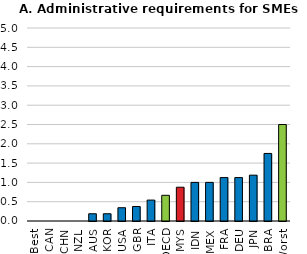
| Category | Series 0 |
|---|---|
| Best | 0 |
| CAN | 0 |
| CHN | 0 |
| NZL | 0 |
| AUS | 0.188 |
| KOR | 0.188 |
| USA | 0.344 |
| GBR | 0.375 |
| ITA | 0.542 |
| OECD | 0.666 |
| MYS | 0.875 |
| IDN | 1 |
| MEX | 1 |
| FRA | 1.125 |
| DEU | 1.125 |
| JPN | 1.188 |
| BRA | 1.75 |
| Worst | 2.5 |